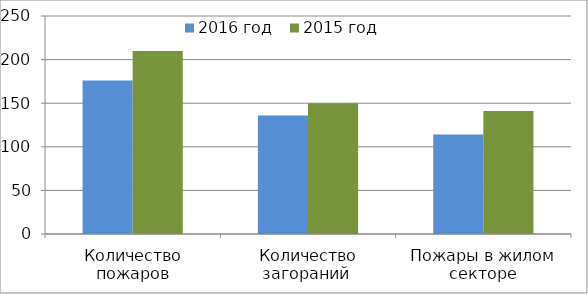
| Category | 2016 год | 2015 год |
|---|---|---|
| Количество пожаров | 176 | 210 |
| Количество загораний  | 136 | 150 |
| Пожары в жилом секторе | 114 | 141 |